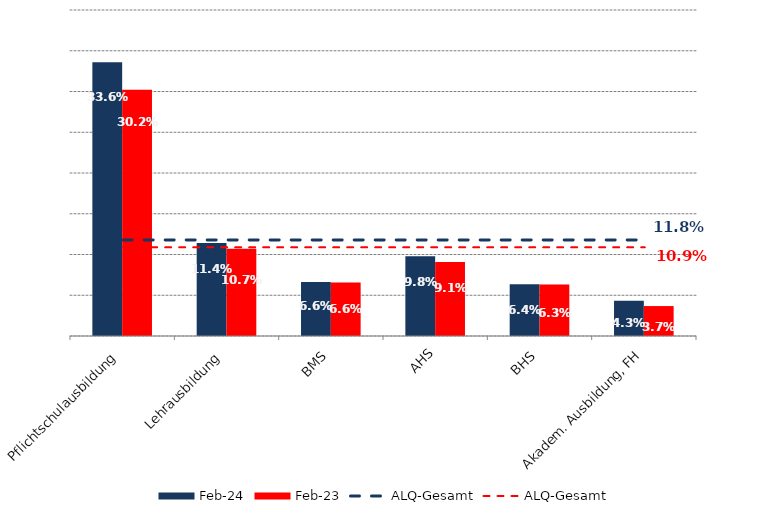
| Category | Feb 24 | Feb 23 |
|---|---|---|
| Pflichtschulausbildung | 0.336 | 0.302 |
| Lehrausbildung | 0.114 | 0.107 |
| BMS | 0.066 | 0.066 |
| AHS | 0.098 | 0.091 |
| BHS | 0.064 | 0.063 |
| Akadem. Ausbildung, FH | 0.043 | 0.037 |